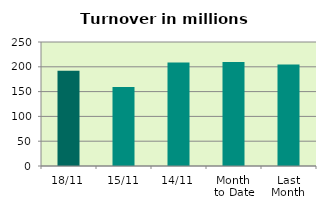
| Category | Series 0 |
|---|---|
| 18/11 | 192.2 |
| 15/11 | 159.284 |
| 14/11 | 208.711 |
| Month 
to Date | 209.582 |
| Last
Month | 204.729 |